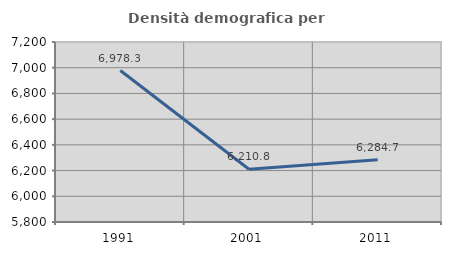
| Category | Densità demografica |
|---|---|
| 1991.0 | 6978.329 |
| 2001.0 | 6210.778 |
| 2011.0 | 6284.696 |